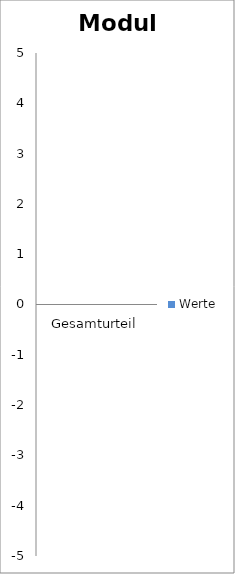
| Category | Werte |
|---|---|
| Gesamturteil | 0 |